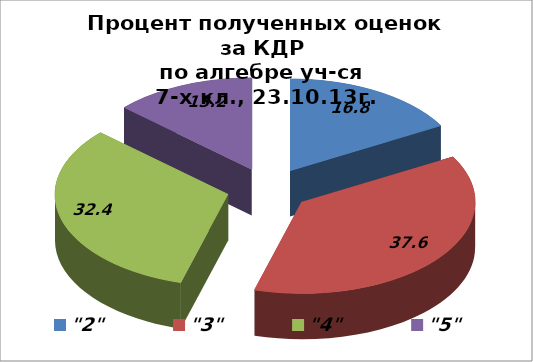
| Category | Series 0 |
|---|---|
| "2" | 16.8 |
| "3" | 37.6 |
| "4" | 32.4 |
| "5" | 13.2 |